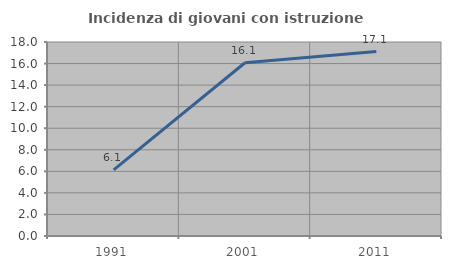
| Category | Incidenza di giovani con istruzione universitaria |
|---|---|
| 1991.0 | 6.142 |
| 2001.0 | 16.075 |
| 2011.0 | 17.109 |